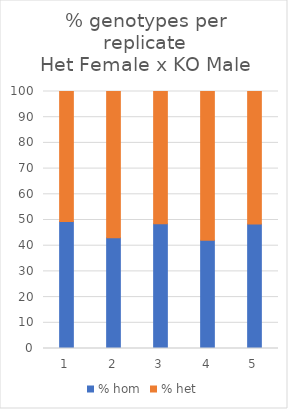
| Category | % hom | % het |
|---|---|---|
| 0 | 49.383 | 50.617 |
| 1 | 43.077 | 56.923 |
| 2 | 48.503 | 51.497 |
| 3 | 42.086 | 57.914 |
| 4 | 48.45 | 51.55 |